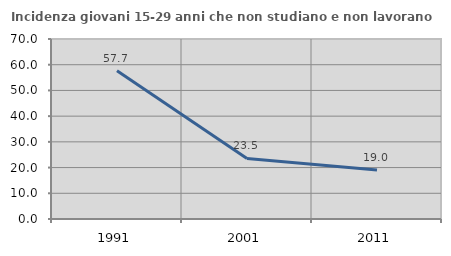
| Category | Incidenza giovani 15-29 anni che non studiano e non lavorano  |
|---|---|
| 1991.0 | 57.664 |
| 2001.0 | 23.532 |
| 2011.0 | 19.028 |